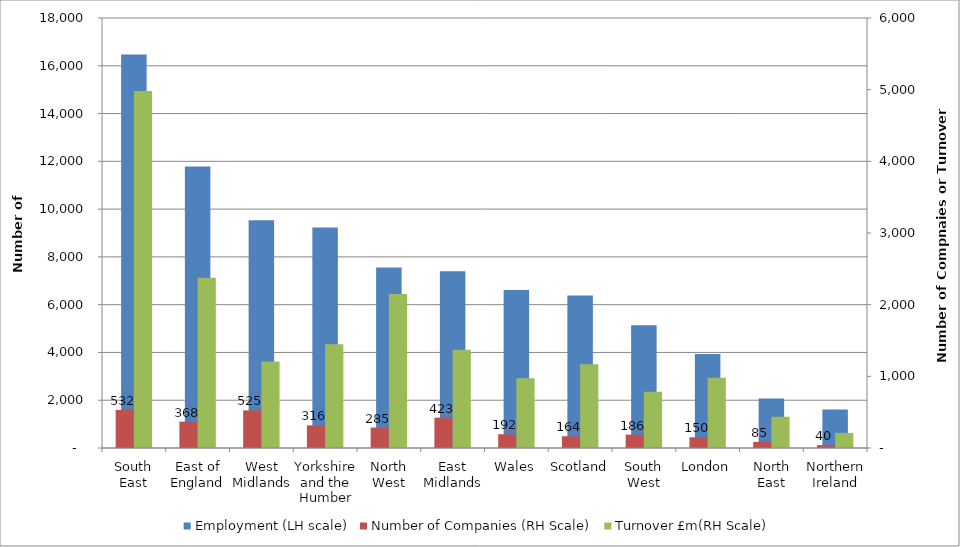
| Category | Employment (LH scale) |
|---|---|
| South East | 16476.89 |
| East of England | 11784.2 |
| West Midlands | 9532.05 |
| Yorkshire and the Humber | 9234.76 |
| North West | 7551.59 |
| East Midlands | 7399.56 |
| Wales | 6619.05 |
| Scotland | 6385.72 |
| South West | 5136.5 |
| London | 3930.95 |
| North East | 2073.95 |
| Northern Ireland | 1614 |